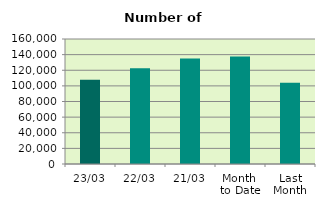
| Category | Series 0 |
|---|---|
| 23/03 | 107780 |
| 22/03 | 122600 |
| 21/03 | 135044 |
| Month 
to Date | 137554.941 |
| Last
Month | 103910.7 |